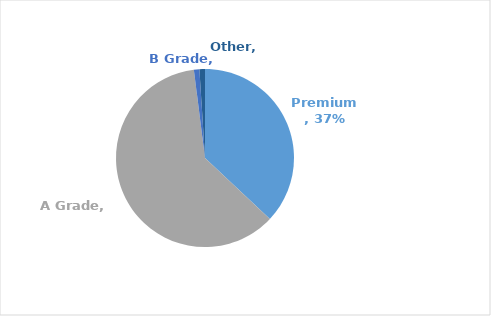
| Category | Series 0 |
|---|---|
| Premium | 0.37 |
| A Grade | 0.61 |
| B Grade | 0.01 |
| Other | 0.01 |